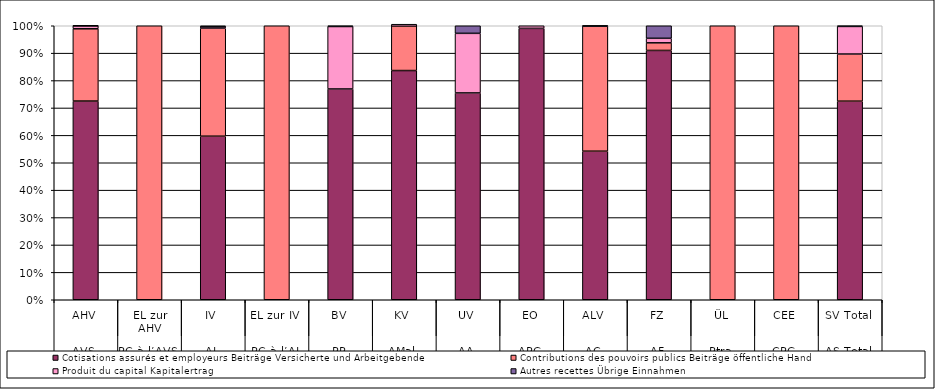
| Category | Cotisations assurés et employeurs Beiträge Versicherte und Arbeitgebende | Contributions des pouvoirs publics Beiträge öffentliche Hand | Produit du capital Kapitalertrag | Autres recettes Übrige Einnahmen |
|---|---|---|---|---|
| 0 | 0.725 | 0.264 | 0.011 | 0 |
| 1 | 0 | 1 | 0 | 0 |
| 2 | 0.597 | 0.394 | 0.005 | 0.007 |
| 3 | 0 | 1 | 0 | 0 |
| 4 | 0.769 | 0 | 0.228 | 0.004 |
| 5 | 0.837 | 0.167 | 0.007 | 0 |
| 6 | 0.755 | 0 | 0.217 | 0.037 |
| 7 | 0.99 | 0 | 0.01 | 0 |
| 8 | 0.542 | 0.456 | 0 | 0.002 |
| 9 | 0.91 | 0.028 | 0.017 | 0.05 |
| 10 | 0 | 1 | 0 | 0 |
| 11 | 0 | 1 | 0 | 0 |
| 12 | 0.725 | 0.172 | 0.101 | 0.002 |